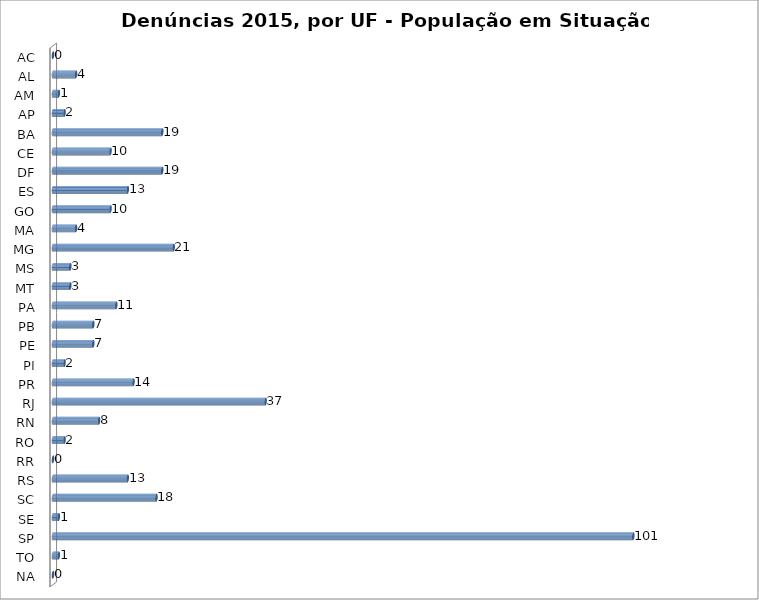
| Category | Series 0 |
|---|---|
| AC | 0 |
| AL | 4 |
| AM | 1 |
| AP | 2 |
| BA | 19 |
| CE | 10 |
| DF | 19 |
| ES | 13 |
| GO | 10 |
| MA | 4 |
| MG | 21 |
| MS | 3 |
| MT | 3 |
| PA | 11 |
| PB | 7 |
| PE | 7 |
| PI | 2 |
| PR | 14 |
| RJ | 37 |
| RN | 8 |
| RO | 2 |
| RR | 0 |
| RS | 13 |
| SC | 18 |
| SE | 1 |
| SP | 101 |
| TO | 1 |
| NA | 0 |